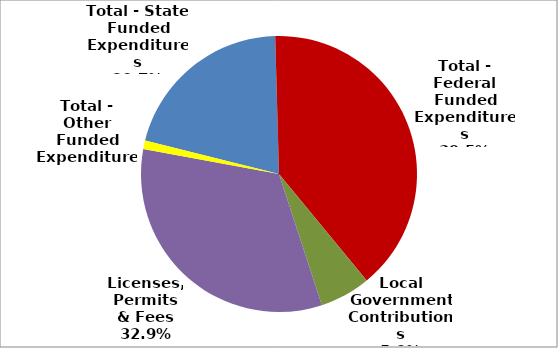
| Category | Series 0 |
|---|---|
| Total - State Funded Expenditures | 1843054 |
| Total - Federal Funded Expenditures | 3519701 |
| Local Government Contributions | 528407 |
| Licenses, Permits & Fees | 2937110 |
| Total - Other Funded Expenditures | 86980 |